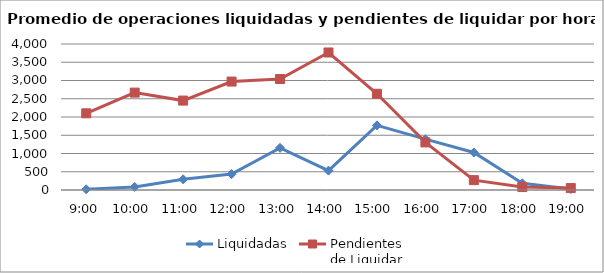
| Category | Liquidadas | Pendientes
de Liquidar |
|---|---|---|
| 0.375 | 18.909 | 2101.091 |
| 0.4166666666666667 | 84.182 | 2668.091 |
| 0.4583333333333333 | 291.682 | 2449.864 |
| 0.5 | 435.682 | 2970.864 |
| 0.5416666666666666 | 1154.636 | 3040.773 |
| 0.583333333333333 | 530.409 | 3767.227 |
| 0.625 | 1769.409 | 2637.227 |
| 0.666666666666667 | 1392.682 | 1303.364 |
| 0.708333333333333 | 1027.318 | 270 |
| 0.75 | 183.545 | 80.545 |
| 0.791666666666667 | 27.591 | 52.727 |